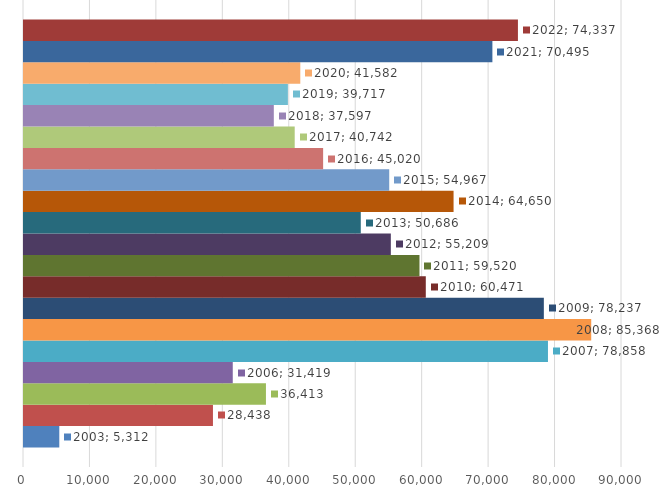
| Category | 2003 | 2004 | 2005 | 2006 | 2007 | 2008 | 2009 | 2010 | 2011 | 2012 | 2013 | 2014 | 2015 | 2016 | 2017 | 2018 | 2019 | 2020 | 2021 | 2022 |
|---|---|---|---|---|---|---|---|---|---|---|---|---|---|---|---|---|---|---|---|---|
| 0 | 5312 | 28438 | 36413 | 31419 | 78858 | 85368 | 78237 | 60471 | 59520 | 55209 | 50686 | 64650 | 54967 | 45020 | 40742 | 37597 | 39717 | 41582 | 70495 | 74337 |